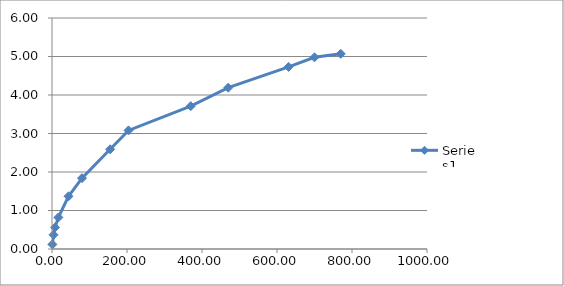
| Category | Series 0 |
|---|---|
| 1.0 | 0.12 |
| 4.0 | 0.37 |
| 8.0 | 0.56 |
| 17.0 | 0.82 |
| 44.0 | 1.37 |
| 80.0 | 1.84 |
| 155.0 | 2.59 |
| 204.0 | 3.08 |
| 370.0 | 3.71 |
| 470.0 | 4.19 |
| 631.0 | 4.73 |
| 700.0 | 4.98 |
| 770.0 | 5.07 |